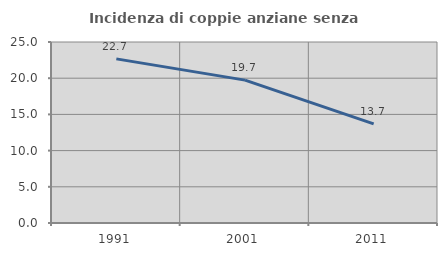
| Category | Incidenza di coppie anziane senza figli  |
|---|---|
| 1991.0 | 22.667 |
| 2001.0 | 19.737 |
| 2011.0 | 13.699 |